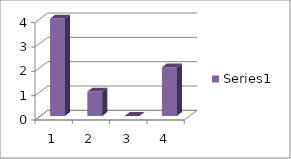
| Category | Series 0 |
|---|---|
| 0 | 4 |
| 1 | 1 |
| 2 | 0 |
| 3 | 2 |